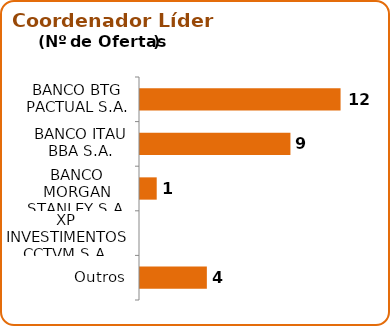
| Category | Líder |
|---|---|
| BANCO BTG PACTUAL S.A. | 12 |
| BANCO ITAU BBA S.A. | 9 |
| BANCO MORGAN STANLEY S.A. | 1 |
| XP INVESTIMENTOS CCTVM S.A. | 0 |
| Outros | 4 |